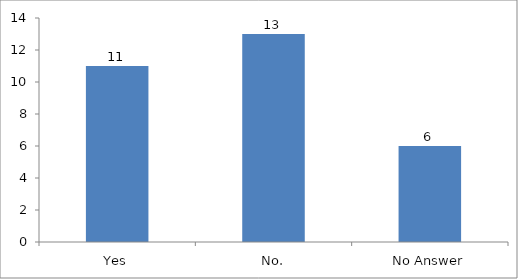
| Category | As a result of participating in the Changemaking Intelligence Test, has anything changed in your thinking or future plans? |
|---|---|
| Yes | 11 |
| No. | 13 |
| No Answer | 6 |